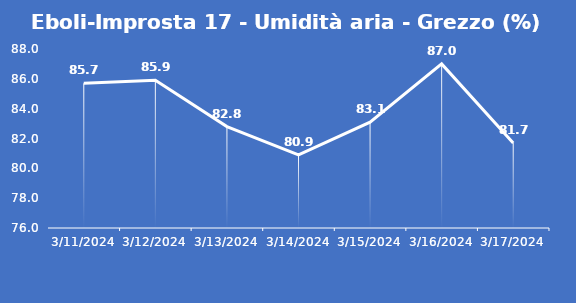
| Category | Eboli-Improsta 17 - Umidità aria - Grezzo (%) |
|---|---|
| 3/11/24 | 85.7 |
| 3/12/24 | 85.9 |
| 3/13/24 | 82.8 |
| 3/14/24 | 80.9 |
| 3/15/24 | 83.1 |
| 3/16/24 | 87 |
| 3/17/24 | 81.7 |